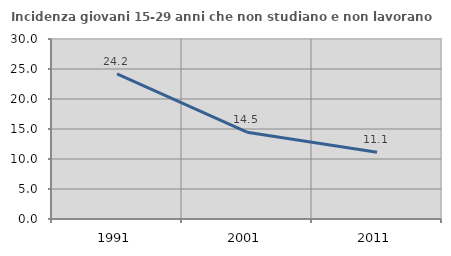
| Category | Incidenza giovani 15-29 anni che non studiano e non lavorano  |
|---|---|
| 1991.0 | 24.169 |
| 2001.0 | 14.474 |
| 2011.0 | 11.111 |